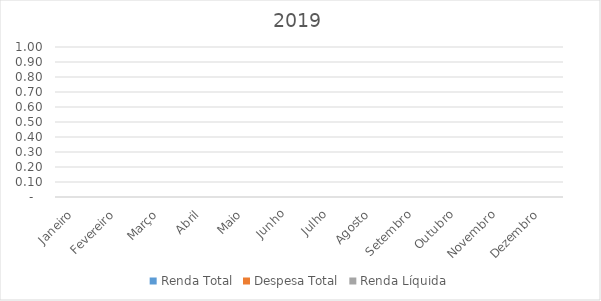
| Category | Renda Total | Despesa Total | Renda Líquida |
|---|---|---|---|
| Janeiro | 0 | 0 | 0 |
| Fevereiro | 0 | 0 | 0 |
| Março | 0 | 0 | 0 |
| Abril | 0 | 0 | 0 |
| Maio | 0 | 0 | 0 |
| Junho | 0 | 0 | 0 |
| Julho | 0 | 0 | 0 |
| Agosto | 0 | 0 | 0 |
| Setembro | 0 | 0 | 0 |
| Outubro | 0 | 0 | 0 |
| Novembro | 0 | 0 | 0 |
| Dezembro | 0 | 0 | 0 |